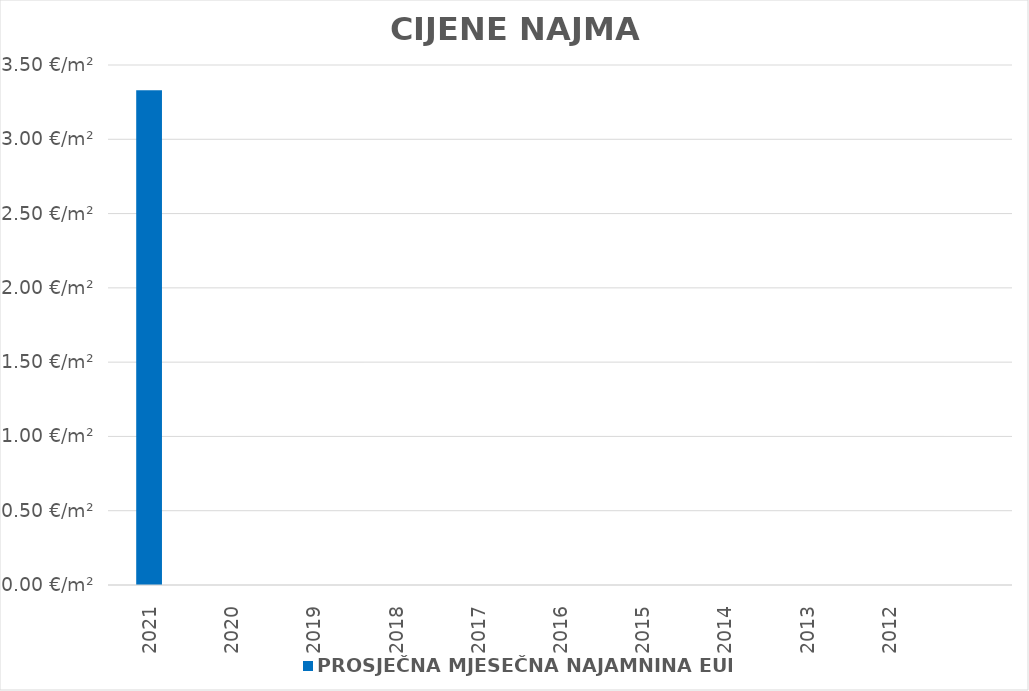
| Category | PROSJEČNA MJESEČNA NAJAMNINA EUR/m² |
|---|---|
| 2021 | 1900-01-03 07:56:27 |
| 2020 | 0 |
| 2019 | 0 |
| 2018 | 0 |
| 2017 | 0 |
| 2016 | 0 |
| 2015 | 0 |
| 2014 | 0 |
| 2013 | 0 |
| 2012 | 0 |